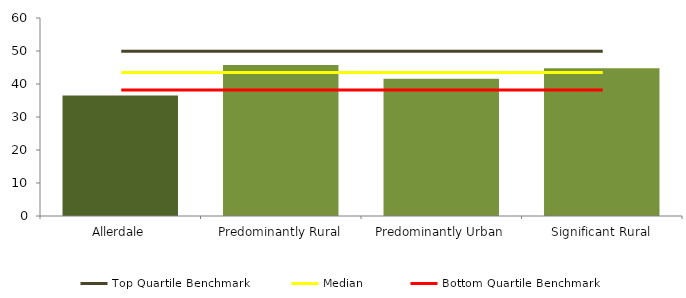
| Category | Series 0 |
|---|---|
| Allerdale | 36.5 |
| Predominantly Rural | 45.76 |
| Predominantly Urban | 41.603 |
| Significant Rural | 44.785 |